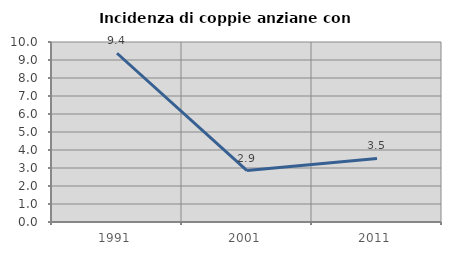
| Category | Incidenza di coppie anziane con figli |
|---|---|
| 1991.0 | 9.375 |
| 2001.0 | 2.857 |
| 2011.0 | 3.529 |